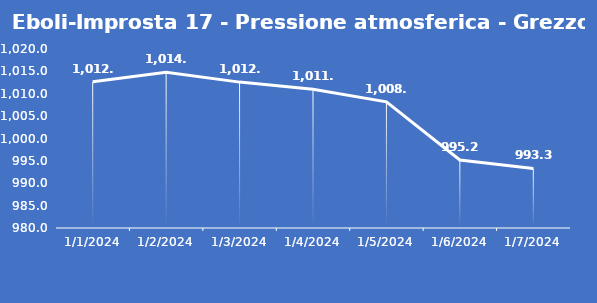
| Category | Eboli-Improsta 17 - Pressione atmosferica - Grezzo (hPa) |
|---|---|
| 1/1/24 | 1012.7 |
| 1/2/24 | 1014.8 |
| 1/3/24 | 1012.6 |
| 1/4/24 | 1011 |
| 1/5/24 | 1008.2 |
| 1/6/24 | 995.2 |
| 1/7/24 | 993.3 |